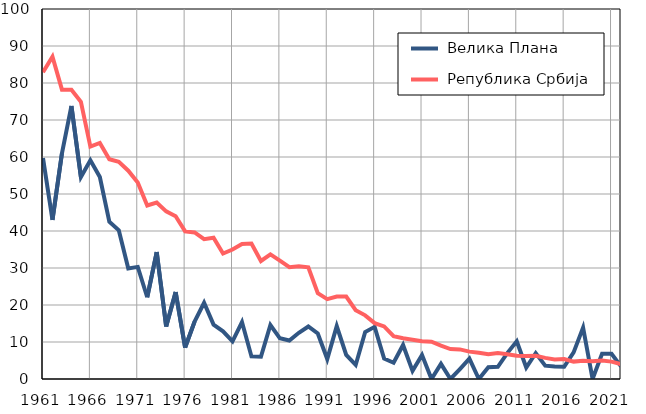
| Category |  Велика Плана |  Република Србија |
|---|---|---|
| 1961.0 | 59.7 | 82.9 |
| 1962.0 | 43 | 87.1 |
| 1963.0 | 61 | 78.2 |
| 1964.0 | 73.8 | 78.2 |
| 1965.0 | 54.6 | 74.9 |
| 1966.0 | 59.1 | 62.8 |
| 1967.0 | 54.6 | 63.8 |
| 1968.0 | 42.5 | 59.4 |
| 1969.0 | 40.2 | 58.7 |
| 1970.0 | 29.9 | 56.3 |
| 1971.0 | 30.3 | 53.1 |
| 1972.0 | 22.1 | 46.9 |
| 1973.0 | 34.3 | 47.7 |
| 1974.0 | 14.2 | 45.3 |
| 1975.0 | 23.5 | 44 |
| 1976.0 | 8.5 | 39.9 |
| 1977.0 | 15.5 | 39.6 |
| 1978.0 | 20.6 | 37.8 |
| 1979.0 | 14.7 | 38.2 |
| 1980.0 | 12.9 | 33.9 |
| 1981.0 | 10.2 | 35 |
| 1982.0 | 15.4 | 36.5 |
| 1983.0 | 6.1 | 36.6 |
| 1984.0 | 6 | 31.9 |
| 1985.0 | 14.6 | 33.7 |
| 1986.0 | 11 | 32 |
| 1987.0 | 10.4 | 30.2 |
| 1988.0 | 12.5 | 30.5 |
| 1989.0 | 14.2 | 30.2 |
| 1990.0 | 12.3 | 23.2 |
| 1991.0 | 5.4 | 21.6 |
| 1992.0 | 14.3 | 22.3 |
| 1993.0 | 6.5 | 22.3 |
| 1994.0 | 3.8 | 18.6 |
| 1995.0 | 12.7 | 17.2 |
| 1996.0 | 14.1 | 15.1 |
| 1997.0 | 5.5 | 14.2 |
| 1998.0 | 4.4 | 11.6 |
| 1999.0 | 9.2 | 11 |
| 2000.0 | 2.2 | 10.6 |
| 2001.0 | 6.5 | 10.2 |
| 2002.0 | 0 | 10.1 |
| 2003.0 | 4.1 | 9 |
| 2004.0 | 0 | 8.1 |
| 2005.0 | 2.7 | 8 |
| 2006.0 | 5.5 | 7.4 |
| 2007.0 | 0 | 7.1 |
| 2008.0 | 3.2 | 6.7 |
| 2009.0 | 3.3 | 7 |
| 2010.0 | 7 | 6.7 |
| 2011.0 | 10.2 | 6.3 |
| 2012.0 | 3.1 | 6.2 |
| 2013.0 | 7 | 6.3 |
| 2014.0 | 3.6 | 5.7 |
| 2015.0 | 3.4 | 5.3 |
| 2016.0 | 3.3 | 5.4 |
| 2017.0 | 7.2 | 4.7 |
| 2018.0 | 13.9 | 4.9 |
| 2019.0 | 0 | 4.8 |
| 2020.0 | 6.8 | 5 |
| 2021.0 | 6.8 | 4.7 |
| 2022.0 | 3.4 | 4 |